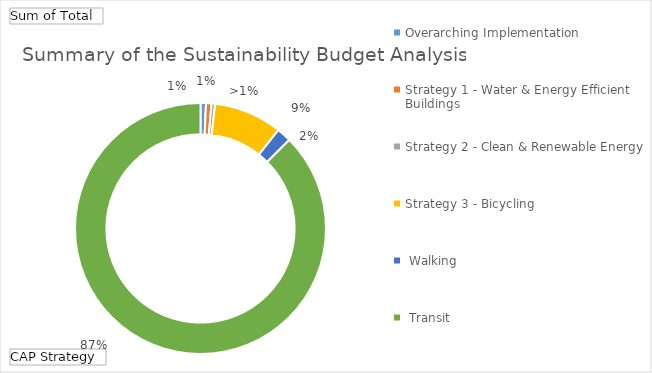
| Category | Total |
|---|---|
| Overarching Implementation | 1074715.7 |
| Strategy 1 - Water & Energy Efficient Buildings | 1076438 |
| Strategy 2 - Clean & Renewable Energy | 712456 |
| Strategy 3 - Bicycling, Walking, Transit, and Land Use | 13422533.1 |
| Strategy 4 - Zero Waste | 2840509 |
| Strategy 5 - Resiliency | 133727710.6 |